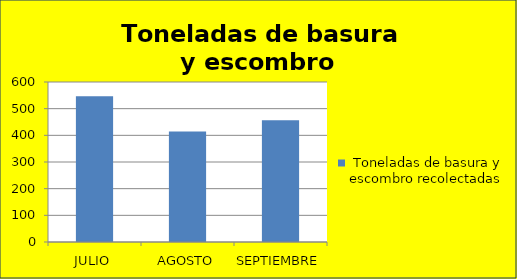
| Category | Series 0 |
|---|---|
| JULIO | 547 |
| AGOSTO | 414 |
| SEPTIEMBRE | 457 |